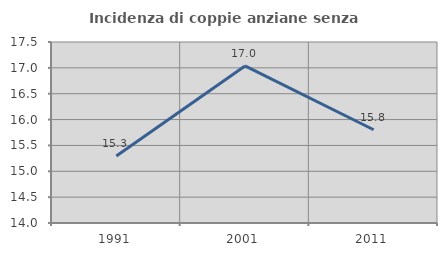
| Category | Incidenza di coppie anziane senza figli  |
|---|---|
| 1991.0 | 15.297 |
| 2001.0 | 17.037 |
| 2011.0 | 15.803 |